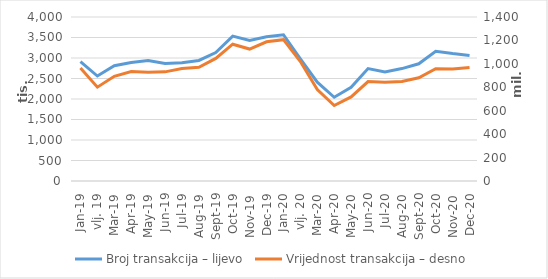
| Category | Broj transakcija – lijevo |
|---|---|
| sij.19 | 2913979 |
| vlj. 19 | 2560577 |
| ožu.19 | 2810234 |
| tra.19 | 2888192 |
| svi.19 | 2939289 |
| lip.19 | 2863556 |
| srp.19 | 2885572 |
| kol.19 | 2940650 |
| ruj.19 | 3131352 |
| lis.19 | 3533789 |
| stu.19 | 3425425 |
| pro.19 | 3519880 |
| sij.20 | 3566905 |
| vlj. 20 | 2979757 |
| ožu.20 | 2408904 |
| tra.20 | 2042680 |
| svi.20 | 2283539 |
| lip.20 | 2743315 |
| srp.20 | 2659954 |
| kol.20 | 2741896 |
| ruj.20 | 2859464 |
| lis.20 | 3165602 |
| stu.20 | 3107930 |
| pro.20 | 3062223 |